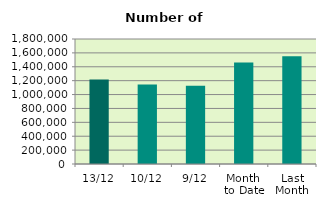
| Category | Series 0 |
|---|---|
| 13/12 | 1215610 |
| 10/12 | 1144692 |
| 9/12 | 1127476 |
| Month 
to Date | 1462292.889 |
| Last
Month | 1553278.182 |